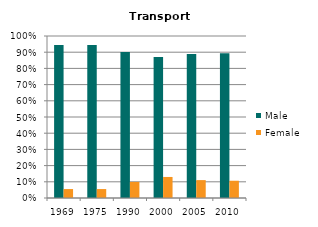
| Category | Male | Female |
|---|---|---|
| 1969.0 | 0.945 | 0.055 |
| 1975.0 | 0.945 | 0.055 |
| 1990.0 | 0.901 | 0.099 |
| 2000.0 | 0.87 | 0.13 |
| 2005.0 | 0.89 | 0.11 |
| 2010.0 | 0.893 | 0.107 |